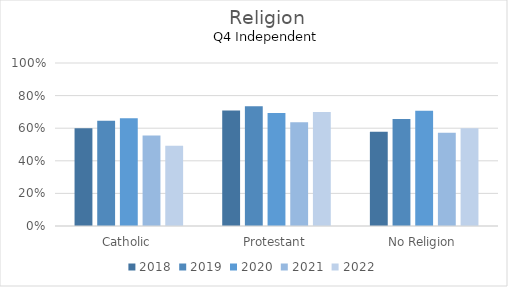
| Category | 2018 | 2019 | 2020 | 2021 | 2022 |
|---|---|---|---|---|---|
| Catholic | 0.599 | 0.645 | 0.661 | 0.556 | 0.492 |
| Protestant | 0.708 | 0.734 | 0.694 | 0.637 | 0.699 |
| No Religion | 0.578 | 0.656 | 0.707 | 0.572 | 0.599 |